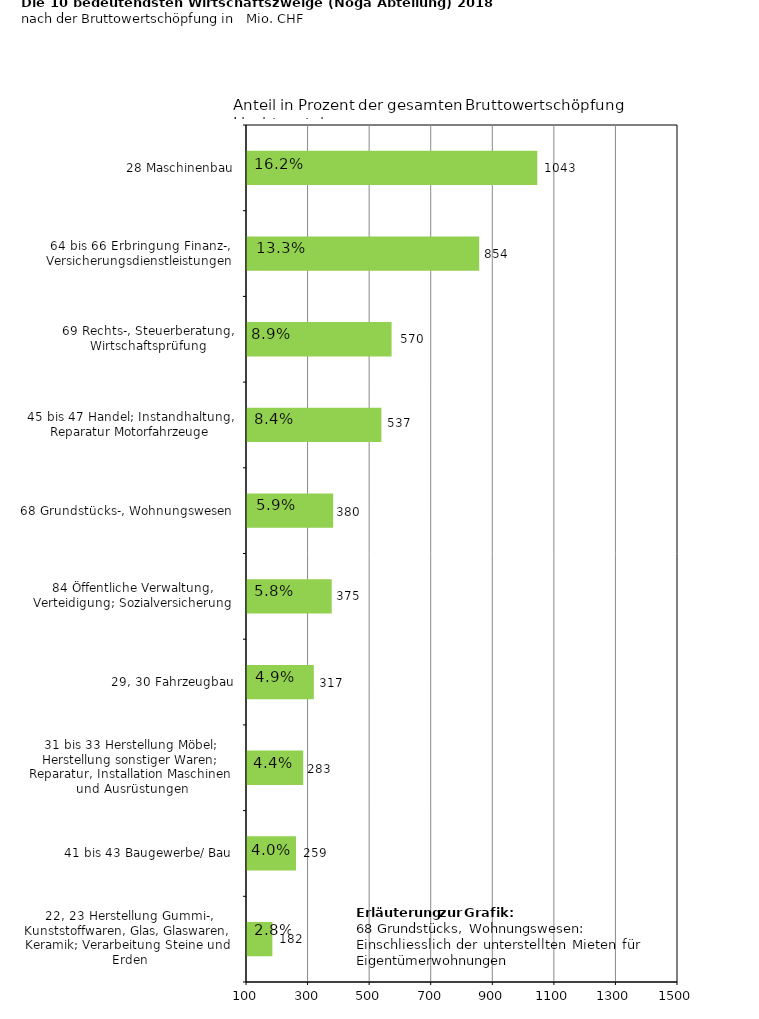
| Category | Series 0 |
|---|---|
| 28 Maschinenbau | 1042.9 |
| 64 bis 66 Erbringung Finanz-, Versicherungsdienstleistungen | 854.2 |
| 69 Rechts-, Steuerberatung, Wirtschaftsprüfung | 569.6 |
| 45 bis 47 Handel; Instandhaltung, Reparatur Motorfahrzeuge | 536.5 |
| 68 Grundstücks-, Wohnungswesen | 379.9 |
| 84 Öffentliche Verwaltung, Verteidigung; Sozialversicherung | 375.2 |
| 29, 30 Fahrzeugbau | 317.1 |
| 31 bis 33 Herstellung Möbel; Herstellung sonstiger Waren; Reparatur, Installation Maschinen und Ausrüstungen | 282.7 |
| 41 bis 43 Baugewerbe/ Bau | 259.2 |
| 22, 23 Herstellung Gummi-, Kunststoffwaren, Glas, Glaswaren, Keramik; Verarbeitung Steine und Erden | 182.4 |